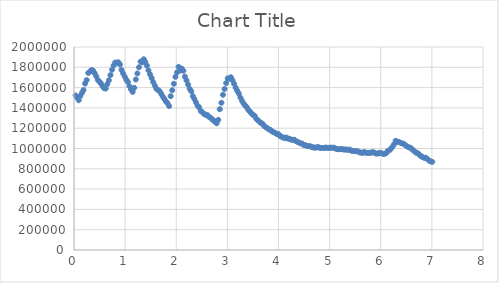
| Category | Series 0 |
|---|---|
| 0.031 | 1522555 |
| 0.062 | 1500897 |
| 0.093 | 1475739 |
| 0.124 | 1517432 |
| 0.155 | 1547202 |
| 0.186 | 1575807 |
| 0.217 | 1639444 |
| 0.248 | 1674019 |
| 0.279 | 1744557 |
| 0.31000000000000005 | 1756877 |
| 0.3410000000000001 | 1772781 |
| 0.3720000000000001 | 1768579 |
| 0.40300000000000014 | 1742837 |
| 0.43400000000000016 | 1712691 |
| 0.4650000000000002 | 1676550 |
| 0.4960000000000002 | 1659781 |
| 0.5270000000000002 | 1641094 |
| 0.5580000000000003 | 1612927 |
| 0.5890000000000003 | 1594009 |
| 0.6200000000000003 | 1590438 |
| 0.6510000000000004 | 1634246 |
| 0.6820000000000004 | 1671882 |
| 0.7130000000000004 | 1722981 |
| 0.7440000000000004 | 1775828 |
| 0.7750000000000005 | 1817842 |
| 0.8060000000000005 | 1846584 |
| 0.8370000000000005 | 1845203 |
| 0.8680000000000005 | 1849183 |
| 0.8990000000000006 | 1827851 |
| 0.9300000000000006 | 1774624 |
| 0.9610000000000006 | 1740071 |
| 0.9920000000000007 | 1708530 |
| 1.0230000000000006 | 1676923 |
| 1.0540000000000005 | 1655751 |
| 1.0850000000000004 | 1613645 |
| 1.1160000000000003 | 1582664 |
| 1.1470000000000002 | 1557912 |
| 1.1780000000000002 | 1597727 |
| 1.209 | 1680019 |
| 1.24 | 1739301 |
| 1.271 | 1800082 |
| 1.3019999999999998 | 1856456 |
| 1.3329999999999997 | 1848086 |
| 1.3639999999999997 | 1879169 |
| 1.3949999999999996 | 1852003 |
| 1.4259999999999995 | 1816040 |
| 1.4569999999999994 | 1768988 |
| 1.4879999999999993 | 1729861 |
| 1.5189999999999992 | 1693847 |
| 1.5499999999999992 | 1654071 |
| 1.580999999999999 | 1619676 |
| 1.611999999999999 | 1588330 |
| 1.642999999999999 | 1576753 |
| 1.6739999999999988 | 1564233 |
| 1.7049999999999987 | 1539487 |
| 1.7359999999999987 | 1511938 |
| 1.7669999999999986 | 1488596 |
| 1.7979999999999985 | 1463382 |
| 1.8289999999999984 | 1446756 |
| 1.8599999999999983 | 1418143 |
| 1.8909999999999982 | 1515087 |
| 1.9219999999999982 | 1573554 |
| 1.952999999999998 | 1637748 |
| 1.983999999999998 | 1705877 |
| 2.014999999999998 | 1750106 |
| 2.045999999999998 | 1804958 |
| 2.076999999999998 | 1768300 |
| 2.1079999999999983 | 1786902 |
| 2.1389999999999985 | 1766006 |
| 2.1699999999999986 | 1708479 |
| 2.2009999999999987 | 1670672 |
| 2.231999999999999 | 1629257 |
| 2.262999999999999 | 1588025 |
| 2.293999999999999 | 1564163 |
| 2.3249999999999993 | 1515757 |
| 2.3559999999999994 | 1486804 |
| 2.3869999999999996 | 1452736 |
| 2.4179999999999997 | 1421315 |
| 2.449 | 1404569 |
| 2.48 | 1369130 |
| 2.511 | 1356831 |
| 2.5420000000000003 | 1340348 |
| 2.5730000000000004 | 1331455 |
| 2.6040000000000005 | 1331697 |
| 2.6350000000000007 | 1313214 |
| 2.666000000000001 | 1305435 |
| 2.697000000000001 | 1290930 |
| 2.728000000000001 | 1275070 |
| 2.7590000000000012 | 1267177 |
| 2.7900000000000014 | 1248134 |
| 2.8210000000000015 | 1282079 |
| 2.8520000000000016 | 1387269 |
| 2.883000000000002 | 1450285 |
| 2.914000000000002 | 1529176 |
| 2.945000000000002 | 1586593 |
| 2.976000000000002 | 1644630 |
| 3.0070000000000023 | 1691393 |
| 3.0380000000000025 | 1687844 |
| 3.0690000000000026 | 1702153 |
| 3.1000000000000028 | 1672161 |
| 3.131000000000003 | 1637099 |
| 3.162000000000003 | 1599266 |
| 3.193000000000003 | 1569141 |
| 3.2240000000000033 | 1541329 |
| 3.2550000000000034 | 1501926 |
| 3.2860000000000036 | 1470043 |
| 3.3170000000000037 | 1443160 |
| 3.348000000000004 | 1424405 |
| 3.379000000000004 | 1406981 |
| 3.410000000000004 | 1379667 |
| 3.4410000000000043 | 1364258 |
| 3.4720000000000044 | 1345747 |
| 3.5030000000000046 | 1330034 |
| 3.5340000000000047 | 1322041 |
| 3.565000000000005 | 1292861 |
| 3.596000000000005 | 1279136 |
| 3.627000000000005 | 1264719 |
| 3.6580000000000052 | 1250506 |
| 3.6890000000000054 | 1243844 |
| 3.7200000000000055 | 1220704 |
| 3.7510000000000057 | 1210013 |
| 3.782000000000006 | 1199447 |
| 3.813000000000006 | 1187727 |
| 3.844000000000006 | 1183023 |
| 3.875000000000006 | 1167574 |
| 3.9060000000000064 | 1160476 |
| 3.9370000000000065 | 1153000 |
| 3.9680000000000066 | 1142789 |
| 3.9990000000000068 | 1141511 |
| 4.0300000000000065 | 1123023 |
| 4.061000000000006 | 1115170 |
| 4.092000000000006 | 1108514 |
| 4.1230000000000055 | 1102203 |
| 4.154000000000005 | 1108324 |
| 4.185000000000005 | 1097267 |
| 4.216000000000005 | 1095211 |
| 4.247000000000004 | 1088036 |
| 4.278000000000004 | 1083831 |
| 4.309000000000004 | 1086640 |
| 4.340000000000003 | 1072504 |
| 4.371000000000003 | 1065420 |
| 4.402000000000003 | 1057577 |
| 4.4330000000000025 | 1050392 |
| 4.464000000000002 | 1047764 |
| 4.495000000000002 | 1034956 |
| 4.526000000000002 | 1032278 |
| 4.557000000000001 | 1025512 |
| 4.588000000000001 | 1022120 |
| 4.619000000000001 | 1022888 |
| 4.65 | 1014129 |
| 4.681 | 1011453 |
| 4.712 | 1007861 |
| 4.742999999999999 | 1010092 |
| 4.773999999999999 | 1014550 |
| 4.804999999999999 | 1006670 |
| 4.8359999999999985 | 1005757 |
| 4.866999999999998 | 1005546 |
| 4.897999999999998 | 1005574 |
| 4.928999999999998 | 1010238 |
| 4.959999999999997 | 1005027 |
| 4.990999999999997 | 1006773 |
| 5.021999999999997 | 1008721 |
| 5.052999999999996 | 1006513 |
| 5.083999999999996 | 1008508 |
| 5.114999999999996 | 999071 |
| 5.1459999999999955 | 993914 |
| 5.176999999999995 | 993239 |
| 5.207999999999995 | 993302 |
| 5.2389999999999946 | 995329 |
| 5.269999999999994 | 990147 |
| 5.300999999999994 | 989652 |
| 5.331999999999994 | 989804 |
| 5.362999999999993 | 986004 |
| 5.393999999999993 | 988966 |
| 5.424999999999993 | 978859 |
| 5.455999999999992 | 975342 |
| 5.486999999999992 | 974804 |
| 5.517999999999992 | 973065 |
| 5.5489999999999915 | 972393 |
| 5.579999999999991 | 962627 |
| 5.610999999999991 | 959982 |
| 5.641999999999991 | 956229 |
| 5.67299999999999 | 964607 |
| 5.70399999999999 | 959740 |
| 5.73499999999999 | 955778 |
| 5.765999999999989 | 957906 |
| 5.796999999999989 | 955607 |
| 5.827999999999989 | 963620 |
| 5.858999999999988 | 963145 |
| 5.889999999999988 | 953082 |
| 5.920999999999988 | 949849 |
| 5.9519999999999875 | 950834 |
| 5.982999999999987 | 957947 |
| 6.013999999999987 | 954286 |
| 6.044999999999987 | 946345 |
| 6.075999999999986 | 947566 |
| 6.106999999999986 | 955680 |
| 6.137999999999986 | 975999 |
| 6.168999999999985 | 981435 |
| 6.199999999999985 | 997082 |
| 6.230999999999985 | 1018373 |
| 6.2619999999999845 | 1043254 |
| 6.292999999999984 | 1075537 |
| 6.323999999999984 | 1067084 |
| 6.3549999999999836 | 1064954 |
| 6.385999999999983 | 1056356 |
| 6.416999999999983 | 1050186 |
| 6.447999999999983 | 1046716 |
| 6.478999999999982 | 1032914 |
| 6.509999999999982 | 1022590 |
| 6.540999999999982 | 1012884 |
| 6.571999999999981 | 1008000 |
| 6.602999999999981 | 999063 |
| 6.633999999999981 | 982067 |
| 6.6649999999999805 | 970123 |
| 6.69599999999998 | 957122 |
| 6.72699999999998 | 952974 |
| 6.75799999999998 | 938154 |
| 6.788999999999979 | 923109 |
| 6.819999999999979 | 916640 |
| 6.850999999999979 | 907122 |
| 6.881999999999978 | 908681 |
| 6.912999999999978 | 895454 |
| 6.943999999999978 | 880325 |
| 6.974999999999977 | 873619 |
| 7.005999999999977 | 868251 |